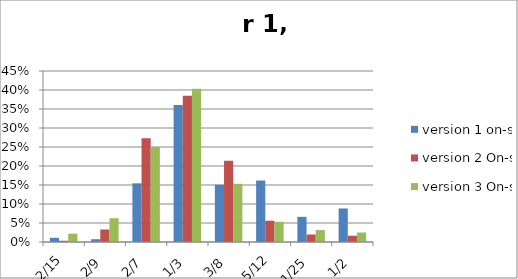
| Category | version 1 on-site | version 2 On-site | version 3 On-site |
|---|---|---|---|
| 0.13333333333333333 | 0.011 | 0.003 | 0.022 |
| 0.2222222222222222 | 0.007 | 0.033 | 0.062 |
| 0.2857142857142857 | 0.154 | 0.273 | 0.25 |
| 0.3333333333333333 | 0.36 | 0.385 | 0.403 |
| 0.375 | 0.151 | 0.214 | 0.153 |
| 0.4166666666666667 | 0.162 | 0.056 | 0.053 |
| 0.44 | 0.066 | 0.02 | 0.031 |
| 0.5 | 0.088 | 0.016 | 0.025 |